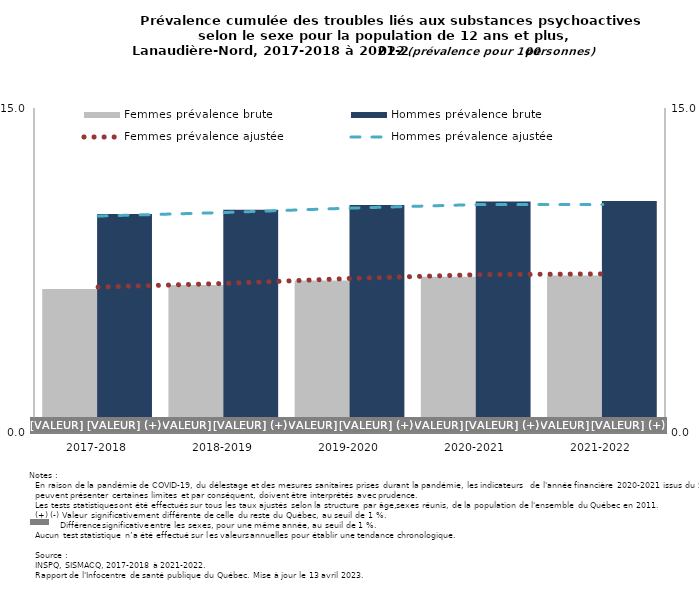
| Category | Femmes prévalence brute | Hommes prévalence brute |
|---|---|---|
| 2017-2018 | 6.647 | 10.113 |
| 2018-2019 | 6.826 | 10.306 |
| 2019-2020 | 7.035 | 10.526 |
| 2020-2021 | 7.208 | 10.687 |
| 2021-2022 | 7.265 | 10.707 |